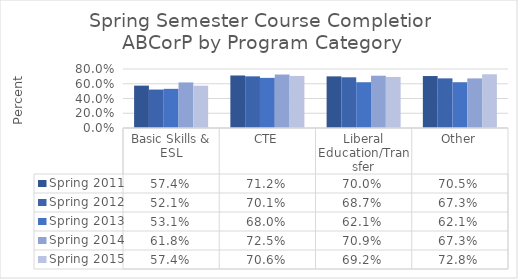
| Category | Spring 2011 | Spring 2012 | Spring 2013 | Spring 2014 | Spring 2015 |
|---|---|---|---|---|---|
| Basic Skills & ESL | 0.574 | 0.521 | 0.531 | 0.618 | 0.574 |
| CTE | 0.712 | 0.701 | 0.68 | 0.725 | 0.706 |
| Liberal Education/Transfer | 0.7 | 0.687 | 0.621 | 0.709 | 0.692 |
| Other | 0.705 | 0.673 | 0.621 | 0.673 | 0.728 |